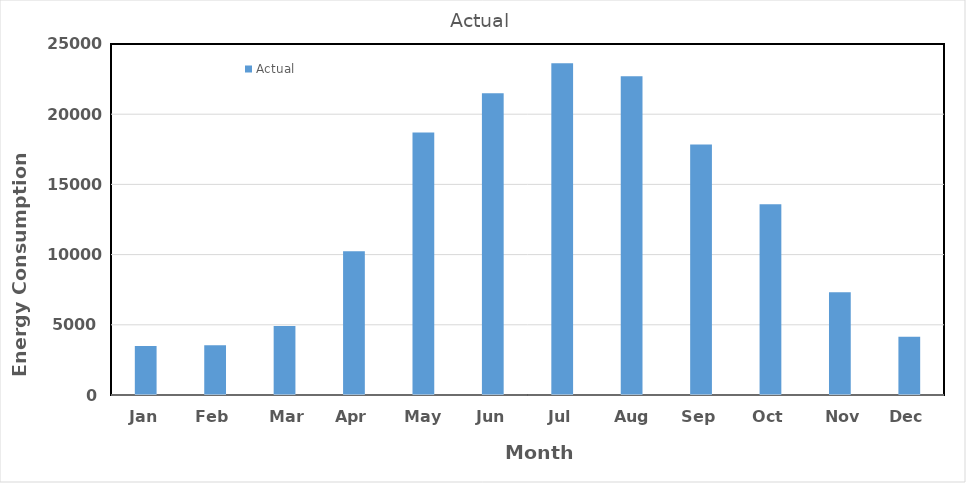
| Category | Actual |
|---|---|
| Jan | 3485.2 |
| Feb | 3545.4 |
| Mar | 4921.041 |
| Apr | 10240.34 |
| May | 18687.8 |
| Jun | 21483.3 |
| Jul | 23623.4 |
| Aug | 22711.6 |
| Sep | 17835.1 |
| Oct | 13582.9 |
| Nov | 7323.6 |
| Dec | 4141.5 |